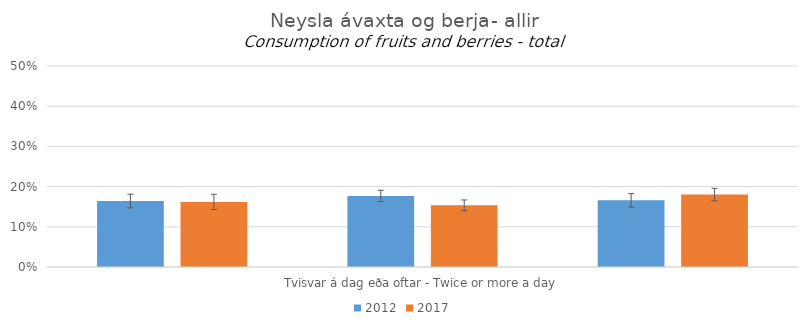
| Category | 2012 | 2017 |
|---|---|---|
| 0 | 0.164 | 0.162 |
| 1 | 0.177 | 0.153 |
| 2 | 0.166 | 0.18 |